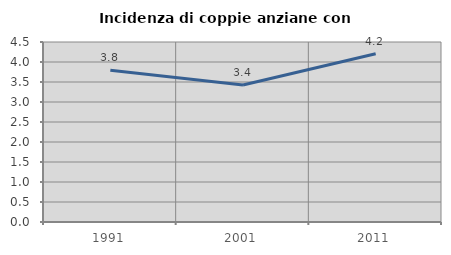
| Category | Incidenza di coppie anziane con figli |
|---|---|
| 1991.0 | 3.794 |
| 2001.0 | 3.423 |
| 2011.0 | 4.206 |